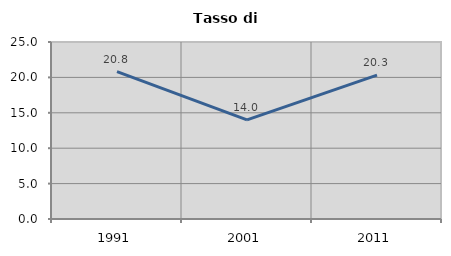
| Category | Tasso di disoccupazione   |
|---|---|
| 1991.0 | 20.803 |
| 2001.0 | 13.991 |
| 2011.0 | 20.318 |